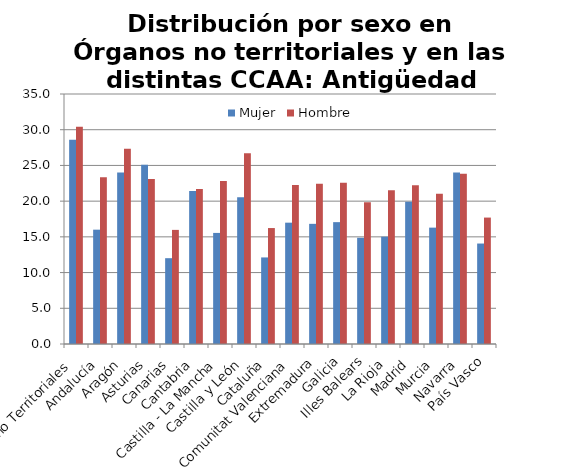
| Category | Mujer | Hombre |
|---|---|---|
| Órganos no Territoriales | 28.586 | 30.407 |
| Andalucía | 16.005 | 23.335 |
| Aragón | 24.006 | 27.341 |
| Asturias | 25.107 | 23.091 |
| Canarias | 12.014 | 15.976 |
| Cantabria | 21.422 | 21.708 |
| Castilla - La Mancha | 15.551 | 22.833 |
| Castilla y León | 20.553 | 26.701 |
| Cataluña | 12.12 | 16.233 |
| Comunitat Valenciana | 16.986 | 22.272 |
| Extremadura | 16.822 | 22.427 |
| Galicia | 17.06 | 22.574 |
| Illes Balears | 14.87 | 19.833 |
| La Rioja | 15.021 | 21.542 |
| Madrid | 19.908 | 22.235 |
| Murcia | 16.292 | 21.043 |
| Navarra | 24.022 | 23.847 |
| País Vasco | 14.065 | 17.7 |